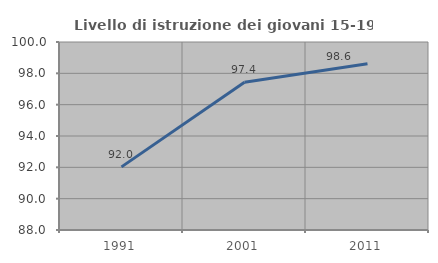
| Category | Livello di istruzione dei giovani 15-19 anni |
|---|---|
| 1991.0 | 92.03 |
| 2001.0 | 97.429 |
| 2011.0 | 98.618 |